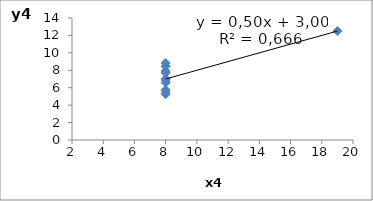
| Category | y4 |
|---|---|
| 8.0 | 6.58 |
| 8.0 | 5.76 |
| 8.0 | 7.71 |
| 8.0 | 8.84 |
| 8.0 | 8.47 |
| 8.0 | 7.04 |
| 8.0 | 5.25 |
| 19.0 | 12.5 |
| 8.0 | 5.56 |
| 8.0 | 7.91 |
| 8.0 | 6.89 |